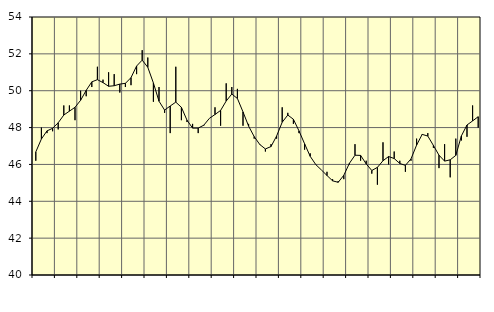
| Category | Piggar | Series 1 |
|---|---|---|
| nan | 46.2 | 46.68 |
| 1.0 | 48 | 47.38 |
| 1.0 | 47.7 | 47.82 |
| 1.0 | 47.8 | 47.96 |
| nan | 47.9 | 48.26 |
| 2.0 | 49.2 | 48.68 |
| 2.0 | 49.2 | 48.89 |
| 2.0 | 48.4 | 49.1 |
| nan | 50 | 49.48 |
| 3.0 | 49.7 | 50.02 |
| 3.0 | 50.2 | 50.48 |
| 3.0 | 51.3 | 50.6 |
| nan | 50.6 | 50.44 |
| 4.0 | 51 | 50.24 |
| 4.0 | 50.9 | 50.27 |
| 4.0 | 49.9 | 50.36 |
| nan | 50.2 | 50.4 |
| 5.0 | 50.3 | 50.71 |
| 5.0 | 50.9 | 51.34 |
| 5.0 | 52.2 | 51.66 |
| nan | 51.8 | 51.27 |
| 6.0 | 49.4 | 50.42 |
| 6.0 | 50.2 | 49.43 |
| 6.0 | 48.8 | 48.95 |
| nan | 47.7 | 49.17 |
| 7.0 | 51.3 | 49.38 |
| 7.0 | 48.4 | 49.1 |
| 7.0 | 48.3 | 48.4 |
| nan | 48.2 | 47.97 |
| 8.0 | 47.7 | 47.97 |
| 8.0 | 48.1 | 48.13 |
| 8.0 | 48.5 | 48.5 |
| nan | 49.1 | 48.71 |
| 9.0 | 48.1 | 48.93 |
| 9.0 | 50.4 | 49.44 |
| 9.0 | 50.2 | 49.82 |
| nan | 50.1 | 49.58 |
| 10.0 | 48.1 | 48.85 |
| 10.0 | 48.2 | 48.08 |
| 10.0 | 47.4 | 47.51 |
| nan | 47.1 | 47.08 |
| 11.0 | 46.7 | 46.84 |
| 11.0 | 47.1 | 46.97 |
| 11.0 | 47.4 | 47.54 |
| nan | 49.1 | 48.29 |
| 12.0 | 48.8 | 48.68 |
| 12.0 | 48.2 | 48.45 |
| 12.0 | 47.7 | 47.82 |
| nan | 46.8 | 47.12 |
| 13.0 | 46.6 | 46.44 |
| 13.0 | 46 | 45.99 |
| 13.0 | 45.7 | 45.7 |
| nan | 45.6 | 45.4 |
| 14.0 | 45.2 | 45.11 |
| 14.0 | 45.1 | 45.03 |
| 14.0 | 45.2 | 45.41 |
| nan | 46 | 46.06 |
| 15.0 | 47.1 | 46.5 |
| 15.0 | 46.2 | 46.49 |
| 15.0 | 46.2 | 46.03 |
| nan | 45.5 | 45.67 |
| 16.0 | 44.9 | 45.84 |
| 16.0 | 47.2 | 46.2 |
| 16.0 | 46 | 46.43 |
| nan | 46.7 | 46.32 |
| 17.0 | 46.2 | 46.05 |
| 17.0 | 45.6 | 45.95 |
| 17.0 | 46.2 | 46.3 |
| nan | 47.4 | 47.05 |
| 18.0 | 47.6 | 47.63 |
| 18.0 | 47.7 | 47.54 |
| 18.0 | 46.9 | 47.03 |
| nan | 45.8 | 46.5 |
| 19.0 | 47.1 | 46.18 |
| 19.0 | 45.3 | 46.25 |
| 19.0 | 47.4 | 46.49 |
| nan | 47.3 | 47.55 |
| 20.0 | 47.5 | 48.14 |
| 20.0 | 49.2 | 48.36 |
| 20.0 | 48 | 48.59 |